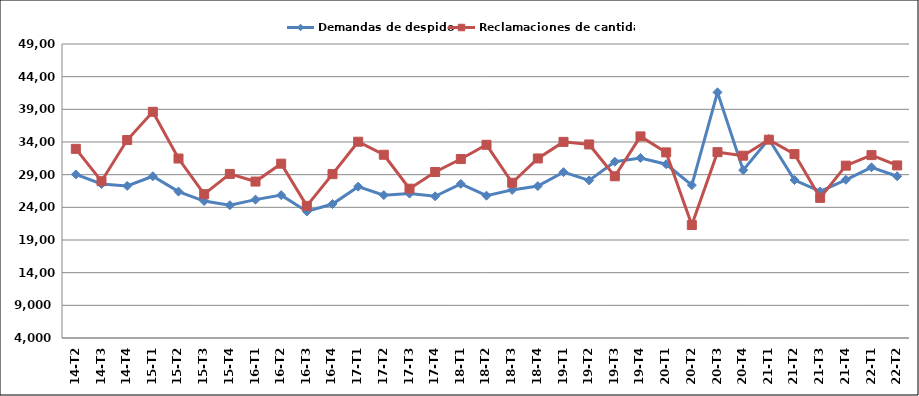
| Category | Demandas de despido | Reclamaciones de cantidad |
|---|---|---|
| 14-T2 | 29037 | 32948 |
| 14-T3 | 27571 | 27999 |
| 14-T4 | 27278 | 34299 |
| 15-T1 | 28755 | 38621 |
| 15-T2 | 26417 | 31470 |
| 15-T3 | 24957 | 26018 |
| 15-T4 | 24328 | 29112 |
| 16-T1 | 25182 | 27945 |
| 16-T2 | 25866 | 30682 |
| 16-T3 | 23364 | 24220 |
| 16-T4 | 24509 | 29081 |
| 17-T1 | 27166 | 34041 |
| 17-T2 | 25869 | 32047 |
| 17-T3 | 26101 | 26854 |
| 17-T4 | 25688 | 29408 |
| 18-T1 | 27589 | 31392 |
| 18-T2 | 25785 | 33573 |
| 18-T3 | 26669 | 27761 |
| 18-T4 | 27251 | 31480 |
| 19-T1 | 29386 | 34020 |
| 19-T2 | 28121 | 33623 |
| 19-T3 | 30981 | 28752 |
| 19-T4 | 31561 | 34857 |
| 20-T1 | 30597 | 32408 |
| 20-T2 | 27401 | 21297 |
| 20-T3 | 41597 | 32446 |
| 20-T4 | 29692 | 31906 |
| 21-T1 | 34461 | 34356 |
| 21-T2 | 28179 | 32151 |
| 21-T3 | 26434 | 25447 |
| 21-T4 | 28219 | 30377 |
| 22-T1 | 30126 | 31990 |
| 22-T2 | 28753 | 30414 |